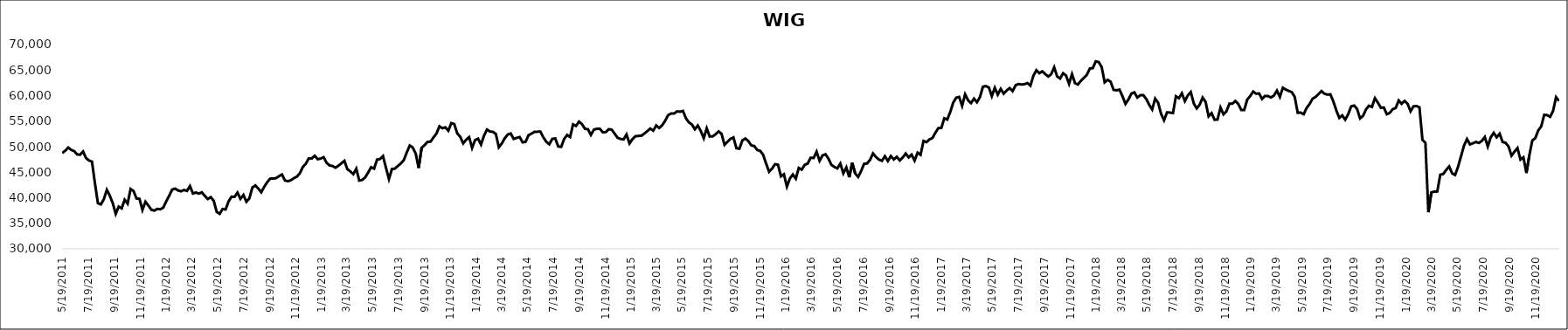
| Category | WIG |
|---|---|
| 5/19/11 | 48747.55 |
| 5/26/11 | 49215.53 |
| 6/2/11 | 49824.93 |
| 6/9/11 | 49378.82 |
| 6/16/11 | 49129.21 |
| 6/23/11 | 48485.26 |
| 6/30/11 | 48414.36 |
| 7/7/11 | 49057.05 |
| 7/14/11 | 47768.38 |
| 7/21/11 | 47291.31 |
| 7/28/11 | 47071.4 |
| 8/4/11 | 42828.22 |
| 8/11/11 | 38934.71 |
| 8/18/11 | 38697.56 |
| 8/25/11 | 39715.27 |
| 9/1/11 | 41553.09 |
| 9/8/11 | 40405.17 |
| 9/15/11 | 38945 |
| 9/22/11 | 36851.2 |
| 9/29/11 | 38264.32 |
| 10/6/11 | 37915.03 |
| 10/13/11 | 39608.13 |
| 10/20/11 | 38835.92 |
| 10/27/11 | 41708.88 |
| 11/3/11 | 41313.92 |
| 11/10/11 | 39853.18 |
| 11/17/11 | 39797.19 |
| 11/24/11 | 37607.27 |
| 12/1/11 | 39215.21 |
| 12/8/11 | 38474.28 |
| 12/15/11 | 37637.47 |
| 12/22/11 | 37478.7 |
| 12/29/11 | 37814.52 |
| 1/5/12 | 37739.39 |
| 1/12/12 | 38062.87 |
| 1/19/12 | 39288.13 |
| 1/26/12 | 40392.48 |
| 2/2/12 | 41602.24 |
| 2/9/12 | 41792.46 |
| 2/16/12 | 41430.3 |
| 2/23/12 | 41258.14 |
| 3/1/12 | 41533.87 |
| 3/8/12 | 41337.97 |
| 3/15/12 | 42281.33 |
| 3/22/12 | 40834.43 |
| 3/29/12 | 41028.06 |
| 4/5/12 | 40802.41 |
| 4/12/12 | 41053.82 |
| 4/19/12 | 40354.53 |
| 4/26/12 | 39761.78 |
| 5/3/12 | 40114.73 |
| 5/10/12 | 39404.16 |
| 5/17/12 | 37228.88 |
| 5/24/12 | 36852.75 |
| 5/31/12 | 37793.58 |
| 6/7/12 | 37707.25 |
| 6/14/12 | 39286.64 |
| 6/21/12 | 40207.61 |
| 6/28/12 | 40165.34 |
| 7/5/12 | 41013.96 |
| 7/12/12 | 39778.1 |
| 7/19/12 | 40545.64 |
| 7/26/12 | 39213.05 |
| 8/2/12 | 39876.95 |
| 8/9/12 | 41976.63 |
| 8/16/12 | 42408.41 |
| 8/23/12 | 41795.63 |
| 8/30/12 | 41077.44 |
| 9/6/12 | 42134.93 |
| 9/13/12 | 43047.41 |
| 9/20/12 | 43737.02 |
| 9/27/12 | 43763.3 |
| 10/4/12 | 43840.23 |
| 10/11/12 | 44224.67 |
| 10/18/12 | 44550.12 |
| 10/25/12 | 43374.6 |
| 11/1/12 | 43232.44 |
| 11/8/12 | 43429.42 |
| 11/15/12 | 43845.94 |
| 11/22/12 | 44121.53 |
| 11/29/12 | 44787.84 |
| 12/6/12 | 46019.97 |
| 12/13/12 | 46653.84 |
| 12/20/12 | 47701.82 |
| 12/27/12 | 47673.03 |
| 1/3/13 | 48222.72 |
| 1/10/13 | 47546.91 |
| 1/17/13 | 47661.37 |
| 1/24/13 | 47942.04 |
| 1/31/13 | 46840.15 |
| 2/7/13 | 46329.66 |
| 2/14/13 | 46211.54 |
| 2/21/13 | 45879.9 |
| 2/28/13 | 46280.36 |
| 3/7/13 | 46745.26 |
| 3/14/13 | 47223.68 |
| 3/21/13 | 45580.47 |
| 3/28/13 | 45147.57 |
| 4/4/13 | 44623.89 |
| 4/11/13 | 45688.48 |
| 4/18/13 | 43364.7 |
| 4/25/13 | 43482.18 |
| 5/2/13 | 43991.51 |
| 5/9/13 | 44943.16 |
| 5/16/13 | 45992.03 |
| 5/23/13 | 45687.76 |
| 5/30/13 | 47476.64 |
| 6/6/13 | 47573.66 |
| 6/13/13 | 48152.82 |
| 6/20/13 | 45870 |
| 6/27/13 | 43667.37 |
| 7/4/13 | 45613.75 |
| 7/11/13 | 45712.72 |
| 7/18/13 | 46221.23 |
| 7/25/13 | 46713.02 |
| 8/1/13 | 47370.81 |
| 8/8/13 | 48862.88 |
| 8/15/13 | 50223.95 |
| 8/22/13 | 49846.48 |
| 8/29/13 | 48676.45 |
| 9/5/13 | 45830.66 |
| 9/12/13 | 49771.55 |
| 9/19/13 | 50300.53 |
| 9/26/13 | 50936.34 |
| 10/3/13 | 50982.03 |
| 10/10/13 | 51806.83 |
| 10/17/13 | 52573.59 |
| 10/24/13 | 53994.46 |
| 10/31/13 | 53607.86 |
| 11/7/13 | 53785.07 |
| 11/14/13 | 53127.16 |
| 11/21/13 | 54621.21 |
| 11/28/13 | 54420.19 |
| 12/5/13 | 52597.13 |
| 12/12/13 | 51947.96 |
| 12/19/13 | 50631.75 |
| 12/26/13 | 51362.3 |
| 1/2/14 | 51865.89 |
| 1/9/14 | 49753.03 |
| 1/16/14 | 51288.7 |
| 1/23/14 | 51569.21 |
| 1/30/14 | 50417.17 |
| 2/6/14 | 52138.87 |
| 2/13/14 | 53349.65 |
| 2/20/14 | 52967.02 |
| 2/27/14 | 52906.04 |
| 3/6/14 | 52487.84 |
| 3/13/14 | 49878.65 |
| 3/20/14 | 50627.71 |
| 3/27/14 | 51642.99 |
| 4/3/14 | 52376.18 |
| 4/10/14 | 52580.73 |
| 4/17/14 | 51510.98 |
| 4/24/14 | 51705.76 |
| 5/1/14 | 51892.77 |
| 5/8/14 | 50851.25 |
| 5/15/14 | 50944.5 |
| 5/22/14 | 52244.13 |
| 5/29/14 | 52553.48 |
| 6/5/14 | 52901.29 |
| 6/12/14 | 52927.91 |
| 6/19/14 | 52937.45 |
| 6/26/14 | 51815.43 |
| 7/3/14 | 50951.73 |
| 7/10/14 | 50474.36 |
| 7/17/14 | 51527.37 |
| 7/24/14 | 51613.47 |
| 7/31/14 | 50037.12 |
| 8/7/14 | 49958.67 |
| 8/14/14 | 51512.57 |
| 8/21/14 | 52294.93 |
| 8/28/14 | 51882.01 |
| 9/4/14 | 54358.49 |
| 9/11/14 | 54065.27 |
| 9/18/14 | 54906.1 |
| 9/25/14 | 54411.77 |
| 10/2/14 | 53498.77 |
| 10/9/14 | 53416.03 |
| 10/16/14 | 52297.79 |
| 10/23/14 | 53335.43 |
| 10/30/14 | 53492 |
| 11/6/14 | 53512.14 |
| 11/13/14 | 52816.35 |
| 11/20/14 | 52848.54 |
| 11/27/14 | 53415.63 |
| 12/4/14 | 53346.86 |
| 12/11/14 | 52550.03 |
| 12/18/14 | 51739.04 |
| 12/25/14 | 51511.68 |
| 1/1/15 | 51416.08 |
| 1/8/15 | 52391 |
| 1/15/15 | 50616.63 |
| 1/22/15 | 51484.81 |
| 1/29/15 | 52040.24 |
| 2/5/15 | 52107.26 |
| 2/12/15 | 52139.81 |
| 2/19/15 | 52572.95 |
| 2/26/15 | 53042.6 |
| 3/5/15 | 53546.4 |
| 3/12/15 | 53136.13 |
| 3/19/15 | 54148.48 |
| 3/26/15 | 53649.9 |
| 4/2/15 | 54179.04 |
| 4/9/15 | 55063.85 |
| 4/16/15 | 56165.1 |
| 4/23/15 | 56492.95 |
| 4/30/15 | 56477.69 |
| 5/7/15 | 56911.34 |
| 5/14/15 | 56845.83 |
| 5/21/15 | 56990.6 |
| 5/28/15 | 55556.13 |
| 6/4/15 | 54749.74 |
| 6/11/15 | 54357.69 |
| 6/18/15 | 53408.53 |
| 6/25/15 | 54141.2 |
| 7/2/15 | 53074.71 |
| 7/9/15 | 51658.71 |
| 7/16/15 | 53588.24 |
| 7/23/15 | 51986.22 |
| 7/30/15 | 52011.81 |
| 8/6/15 | 52418.07 |
| 8/13/15 | 52995.96 |
| 8/20/15 | 52508.32 |
| 8/27/15 | 50366.09 |
| 9/3/15 | 50977.06 |
| 9/10/15 | 51527.08 |
| 9/17/15 | 51801.58 |
| 9/24/15 | 49701.31 |
| 10/1/15 | 49593.95 |
| 10/8/15 | 51222.77 |
| 10/15/15 | 51599.62 |
| 10/22/15 | 51094.29 |
| 10/29/15 | 50262.68 |
| 11/5/15 | 50125.85 |
| 11/12/15 | 49358.2 |
| 11/19/15 | 49177.74 |
| 11/26/15 | 48418.14 |
| 12/3/15 | 46693.09 |
| 12/10/15 | 45093.65 |
| 12/17/15 | 45684.05 |
| 12/24/15 | 46564.08 |
| 12/31/15 | 46467.38 |
| 1/7/16 | 44195.91 |
| 1/14/16 | 44596.08 |
| 1/21/16 | 42180.3 |
| 1/28/16 | 43778.96 |
| 2/4/16 | 44557.64 |
| 2/11/16 | 43741.96 |
| 2/18/16 | 45834.88 |
| 2/25/16 | 45497.77 |
| 3/3/16 | 46448.27 |
| 3/10/16 | 46686.74 |
| 3/17/16 | 47833.39 |
| 3/24/16 | 47778.01 |
| 3/31/16 | 49017.35 |
| 4/7/16 | 47231.36 |
| 4/14/16 | 48285.21 |
| 4/21/16 | 48514.39 |
| 4/28/16 | 47643.7 |
| 5/5/16 | 46430.16 |
| 5/12/16 | 46022.02 |
| 5/19/16 | 45751.68 |
| 5/26/16 | 46695.37 |
| 6/2/16 | 44772.72 |
| 6/9/16 | 45940.12 |
| 6/16/16 | 44007.81 |
| 6/23/16 | 46826.85 |
| 6/30/16 | 44748.53 |
| 7/7/16 | 44077.16 |
| 7/14/16 | 45246.26 |
| 7/21/16 | 46639.17 |
| 7/28/16 | 46718.98 |
| 8/4/16 | 47407.09 |
| 8/11/16 | 48675.96 |
| 8/18/16 | 47967.07 |
| 8/25/16 | 47464.07 |
| 9/1/16 | 47221.32 |
| 9/8/16 | 48129.15 |
| 9/15/16 | 47198.39 |
| 9/22/16 | 48154.88 |
| 9/29/16 | 47494.62 |
| 10/6/16 | 48014.44 |
| 10/13/16 | 47303.15 |
| 10/20/16 | 47894.17 |
| 10/27/16 | 48651.28 |
| 11/3/16 | 47899.61 |
| 11/10/16 | 48447.59 |
| 11/17/16 | 47274.21 |
| 11/24/16 | 48824.83 |
| 12/1/16 | 48404.21 |
| 12/8/16 | 51123.43 |
| 12/15/16 | 50881.35 |
| 12/22/16 | 51423.71 |
| 12/29/16 | 51703.91 |
| 1/5/17 | 52721.67 |
| 1/12/17 | 53650.94 |
| 1/19/17 | 53654.99 |
| 1/26/17 | 55560.23 |
| 2/2/17 | 55303.11 |
| 2/9/17 | 56785.52 |
| 2/16/17 | 58610.28 |
| 2/23/17 | 59583.89 |
| 3/2/17 | 59743.64 |
| 3/9/17 | 57986.6 |
| 3/16/17 | 60247.18 |
| 3/23/17 | 59093.68 |
| 3/30/17 | 58527.2 |
| 4/6/17 | 59406.36 |
| 4/13/17 | 58695.36 |
| 4/20/17 | 59700.07 |
| 4/27/17 | 61731.8 |
| 5/4/17 | 61862.8 |
| 5/11/17 | 61598.78 |
| 5/18/17 | 59901.12 |
| 5/25/17 | 61536.22 |
| 6/1/17 | 60181.96 |
| 6/8/17 | 61312.68 |
| 6/15/17 | 60381.07 |
| 6/22/17 | 60987.33 |
| 6/29/17 | 61475.96 |
| 7/6/17 | 60869.83 |
| 7/13/17 | 62018.68 |
| 7/20/17 | 62269.72 |
| 7/27/17 | 62171.7 |
| 8/3/17 | 62231.08 |
| 8/10/17 | 62451.57 |
| 8/17/17 | 61949.4 |
| 8/24/17 | 63886.54 |
| 8/31/17 | 64973.76 |
| 9/7/17 | 64381.87 |
| 9/14/17 | 64748.47 |
| 9/21/17 | 64209.19 |
| 9/28/17 | 63729.77 |
| 10/5/17 | 64185.71 |
| 10/12/17 | 65529.1 |
| 10/19/17 | 63745 |
| 10/26/17 | 63342.71 |
| 11/2/17 | 64375.83 |
| 11/9/17 | 63923.62 |
| 11/16/17 | 62299.29 |
| 11/23/17 | 64207.77 |
| 11/30/17 | 62440.31 |
| 12/7/17 | 62164.65 |
| 12/14/17 | 62916.39 |
| 12/21/17 | 63477.25 |
| 12/28/17 | 64053.47 |
| 1/4/18 | 65297.96 |
| 1/11/18 | 65379.88 |
| 1/18/18 | 66709.12 |
| 1/25/18 | 66561.79 |
| 2/1/18 | 65585.79 |
| 2/8/18 | 62604.89 |
| 2/15/18 | 63078.16 |
| 2/22/18 | 62717.27 |
| 3/1/18 | 61116.96 |
| 3/8/18 | 61036.99 |
| 3/15/18 | 61156.91 |
| 3/22/18 | 59862.55 |
| 3/29/18 | 58377.42 |
| 4/5/18 | 59244.04 |
| 4/12/18 | 60393.23 |
| 4/19/18 | 60629.81 |
| 4/26/18 | 59628.04 |
| 5/3/18 | 60066.46 |
| 5/10/18 | 60091.26 |
| 5/17/18 | 59337.27 |
| 5/24/18 | 58189.49 |
| 5/31/18 | 57282.73 |
| 6/7/18 | 59412.76 |
| 6/14/18 | 58603.93 |
| 6/21/18 | 56425.25 |
| 6/28/18 | 55169.77 |
| 7/5/18 | 56719.88 |
| 7/12/18 | 56671.44 |
| 7/19/18 | 56585.5 |
| 7/26/18 | 59871.2 |
| 8/2/18 | 59484.35 |
| 8/9/18 | 60455.75 |
| 8/16/18 | 58921.44 |
| 8/23/18 | 60044.45 |
| 8/30/18 | 60690.32 |
| 9/6/18 | 58469.6 |
| 9/13/18 | 57493.38 |
| 9/20/18 | 58231.57 |
| 9/27/18 | 59616.27 |
| 10/4/18 | 58736.08 |
| 10/11/18 | 55941.06 |
| 10/18/18 | 56560.93 |
| 10/25/18 | 55271.63 |
| 11/1/18 | 55312.71 |
| 11/8/18 | 57655.73 |
| 11/15/18 | 56329.01 |
| 11/22/18 | 56932.62 |
| 11/29/18 | 58412.94 |
| 12/6/18 | 58409.09 |
| 12/13/18 | 58952.55 |
| 12/20/18 | 58349.03 |
| 12/27/18 | 57183.28 |
| 1/3/19 | 57192.42 |
| 1/10/19 | 59219.23 |
| 1/17/19 | 59894.9 |
| 1/24/19 | 60791.02 |
| 1/31/19 | 60367.42 |
| 2/7/19 | 60422.38 |
| 2/14/19 | 59348.4 |
| 2/21/19 | 59938.07 |
| 2/28/19 | 59903.7 |
| 3/7/19 | 59638.3 |
| 3/14/19 | 60002.72 |
| 3/21/19 | 60976.51 |
| 3/28/19 | 59752.66 |
| 4/4/19 | 61533.27 |
| 4/11/19 | 61168.92 |
| 4/18/19 | 60910.11 |
| 4/25/19 | 60680.62 |
| 5/2/19 | 59744.3 |
| 5/9/19 | 56637.25 |
| 5/16/19 | 56664.5 |
| 5/23/19 | 56351.13 |
| 5/30/19 | 57566.83 |
| 6/6/19 | 58360.5 |
| 6/13/19 | 59374.38 |
| 6/20/19 | 59738.56 |
| 6/27/19 | 60293.37 |
| 7/4/19 | 60888.98 |
| 7/11/19 | 60362.11 |
| 7/18/19 | 60192.6 |
| 7/25/19 | 60249.72 |
| 8/1/19 | 58863.73 |
| 8/8/19 | 57102.69 |
| 8/15/19 | 55634.7 |
| 8/22/19 | 56118.92 |
| 8/29/19 | 55273.05 |
| 9/5/19 | 56358.3 |
| 9/12/19 | 57886.6 |
| 9/19/19 | 58053.03 |
| 9/26/19 | 57377.87 |
| 10/3/19 | 55523.06 |
| 10/10/19 | 56034.97 |
| 10/17/19 | 57297.12 |
| 10/24/19 | 58012.97 |
| 10/31/19 | 57783.02 |
| 11/7/19 | 59492.22 |
| 11/14/19 | 58622.1 |
| 11/21/19 | 57618.54 |
| 11/28/19 | 57669.94 |
| 12/5/19 | 56338.75 |
| 12/12/19 | 56621.06 |
| 12/19/19 | 57346.95 |
| 12/26/19 | 57569.71 |
| 1/2/20 | 59048.28 |
| 1/9/20 | 58397.17 |
| 1/16/20 | 58962.37 |
| 1/23/20 | 58401.85 |
| 1/30/20 | 56923.36 |
| 2/6/20 | 57900.04 |
| 2/13/20 | 57960.23 |
| 2/20/20 | 57693.12 |
| 2/27/20 | 51318.69 |
| 3/5/20 | 50753.91 |
| 3/12/20 | 37164.02 |
| 3/19/20 | 41041.92 |
| 3/26/20 | 41202.98 |
| 4/2/20 | 41219.51 |
| 4/9/20 | 44499.23 |
| 4/16/20 | 44645.12 |
| 4/23/20 | 45450.43 |
| 4/30/20 | 46117 |
| 5/7/20 | 44769.05 |
| 5/14/20 | 44450.71 |
| 5/21/20 | 46073.39 |
| 5/28/20 | 48144.34 |
| 6/4/20 | 50202.54 |
| 6/11/20 | 51486.94 |
| 6/18/20 | 50445.13 |
| 6/25/20 | 50658.89 |
| 7/2/20 | 50937.18 |
| 7/9/20 | 50726.22 |
| 7/16/20 | 51121.23 |
| 7/23/20 | 51890.42 |
| 7/30/20 | 50024.63 |
| 8/6/20 | 51816.87 |
| 8/13/20 | 52706.25 |
| 8/20/20 | 51842.65 |
| 8/27/20 | 52528.67 |
| 9/3/20 | 50915.67 |
| 9/10/20 | 50757.07 |
| 9/17/20 | 50035.54 |
| 9/24/20 | 48241.11 |
| 10/1/20 | 49035.41 |
| 10/8/20 | 49727.34 |
| 10/15/20 | 47482 |
| 10/22/20 | 47910.38 |
| 10/29/20 | 44840.6 |
| 11/5/20 | 48295.31 |
| 11/12/20 | 51229.23 |
| 11/19/20 | 51651.4 |
| 11/26/20 | 53187.31 |
| 12/3/20 | 53967.82 |
| 12/10/20 | 56230.4 |
| 12/17/20 | 56176.07 |
| 12/24/20 | 55843.46 |
| 12/31/20 | 57025 |
| 1/7/21 | 59687 |
| 1/14/21 | 58945.17 |